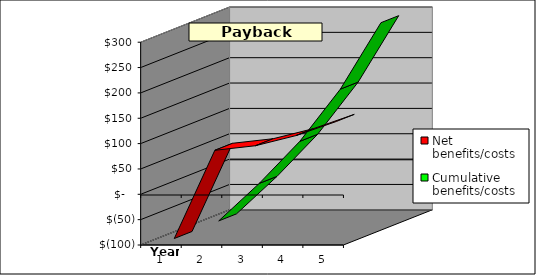
| Category | Net benefits/costs | Cumulative benefits/costs |
|---|---|---|
| 0 | -100 | -100 |
| 1 | 74 | -26 |
| 2 | 83 | 57 |
| 3 | 103 | 160 |
| 4 | 131 | 291 |